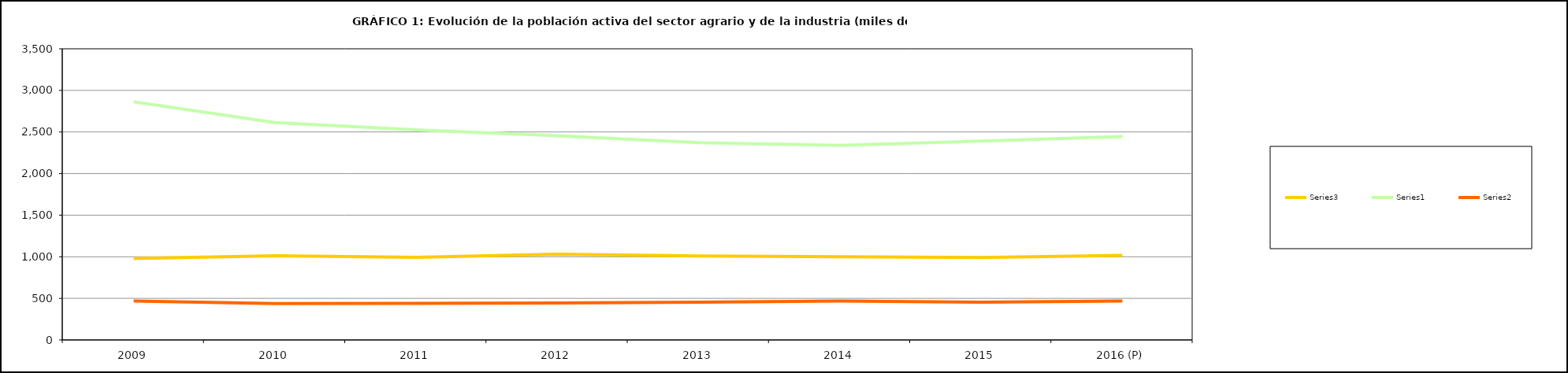
| Category | Series 3 | Series 0 | Series 1 |
|---|---|---|---|
| 2009 | 979.3 | 2862.5 | 467.6 |
| 2010 | 1011.9 | 2612.675 | 438.425 |
| 2011 | 993.225 | 2525.825 | 439.575 |
| 2012 | 1032.125 | 2454.25 | 445.725 |
| 2013 | 1010.5 | 2372.975 | 454.075 |
| 2014 | 1000.9 | 2339.7 | 468.5 |
| 2015 | 990.325 | 2391.725 | 454.1 |
| 2016 (P) | 1016.75 | 2445.73 | 468.93 |